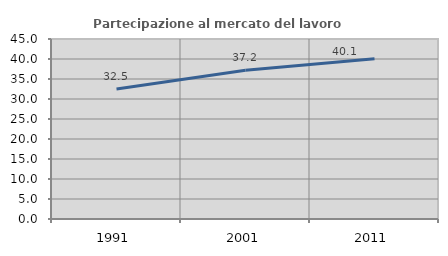
| Category | Partecipazione al mercato del lavoro  femminile |
|---|---|
| 1991.0 | 32.498 |
| 2001.0 | 37.18 |
| 2011.0 | 40.075 |